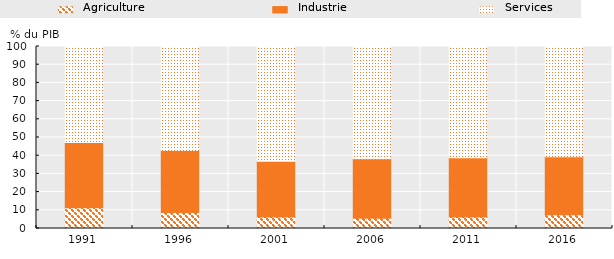
| Category | Agriculture | Industrie | Services |
|---|---|---|---|
| 1991.0 | 11.4 | 35.9 | 52.7 |
| 1996.0 | 8.8 | 34 | 57.2 |
| 2001.0 | 6.3 | 30.7 | 63.2 |
| 2006.0 | 5.7 | 32.6 | 61.7 |
| 2011.0 | 6.3 | 32.6 | 61.1 |
| 2016.0 | 7.6 | 31.8 | 60.6 |